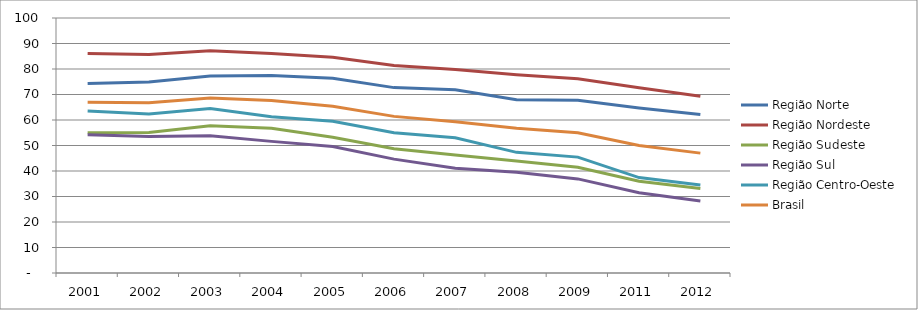
| Category | Região Norte | Região Nordeste | Região Sudeste | Região Sul | Região Centro-Oeste | Brasil |
|---|---|---|---|---|---|---|
| 2001.0 | 74.3 | 86.06 | 55 | 54.19 | 63.53 | 66.92 |
| 2002.0 | 74.94 | 85.72 | 55.06 | 53.57 | 62.39 | 66.72 |
| 2003.0 | 77.22 | 87.2 | 57.73 | 53.82 | 64.46 | 68.65 |
| 2004.0 | 77.46 | 86.06 | 56.79 | 51.62 | 61.31 | 67.61 |
| 2005.0 | 76.35 | 84.59 | 53.24 | 49.58 | 59.52 | 65.41 |
| 2006.0 | 72.7 | 81.37 | 48.7 | 44.66 | 55 | 61.42 |
| 2007.0 | 71.86 | 79.76 | 46.28 | 41.11 | 53.06 | 59.32 |
| 2008.0 | 67.98 | 77.75 | 43.88 | 39.55 | 47.31 | 56.8 |
| 2009.0 | 67.76 | 76.18 | 41.49 | 36.9 | 45.44 | 54.96 |
| 2011.0 | 64.72 | 72.66 | 36.01 | 31.48 | 37.42 | 50 |
| 2012.0 | 62.16 | 69.34 | 33.13 | 28.23 | 34.53 | 47.01 |